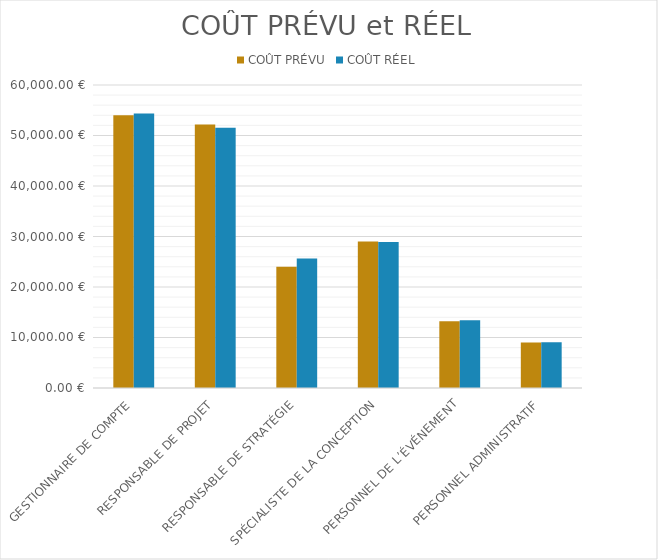
| Category | COÛT PRÉVU | COÛT RÉEL |
|---|---|---|
| GESTIONNAIRE DE COMPTE | 54000 | 54360 |
| RESPONSABLE DE PROJET | 52200 | 51540 |
| RESPONSABLE DE STRATÉGIE | 24000 | 25650 |
| SPÉCIALISTE DE LA CONCEPTION | 29000 | 28900 |
| PERSONNEL DE L’ÉVÉNEMENT | 13200 | 13400 |
| PERSONNEL ADMINISTRATIF | 9000 | 9060 |